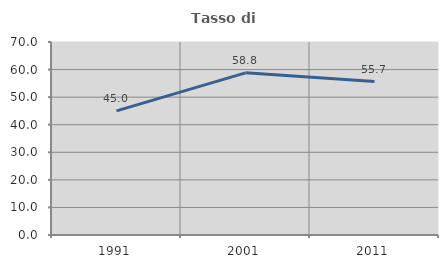
| Category | Tasso di occupazione   |
|---|---|
| 1991.0 | 45.038 |
| 2001.0 | 58.824 |
| 2011.0 | 55.665 |